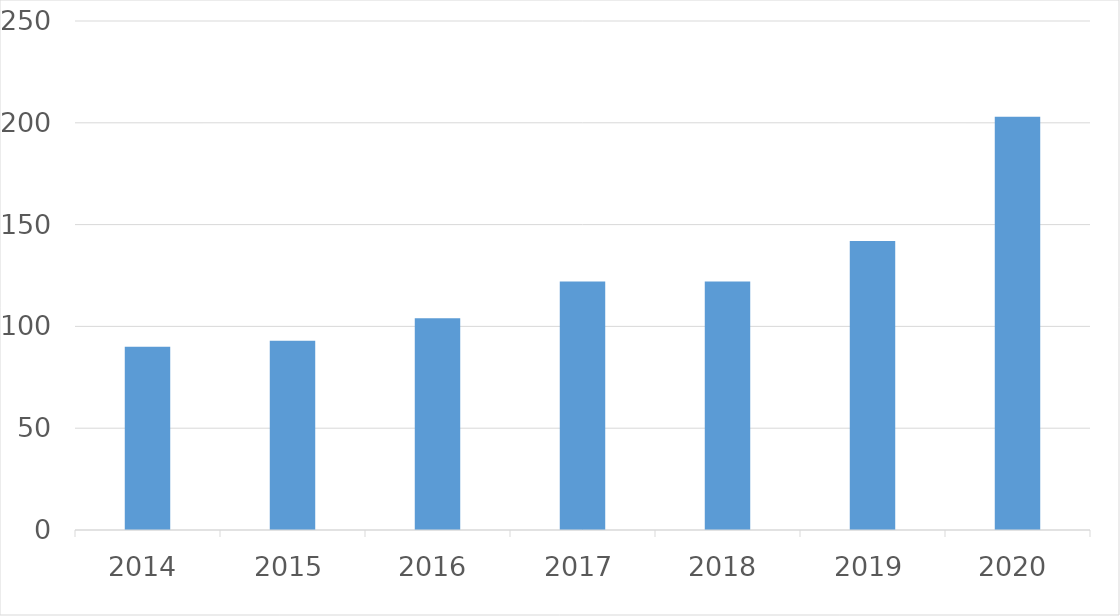
| Category | Series 0 |
|---|---|
| 2014 | 90 |
| 2015 | 93 |
| 2016 | 104 |
| 2017 | 122 |
| 2018 | 122 |
| 2019 | 142 |
| 2020 | 203 |